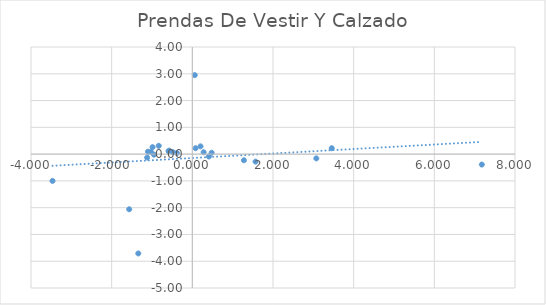
| Category | Prendas De Vestir Y Calzado |
|---|---|
| 0.06052582200249956 | 2.95 |
| -1.339539147515001 | -3.71 |
| -1.1203229332582998 | -0.13 |
| -0.9862037445886013 | 0.26 |
| -3.4662710747771994 | -1 |
| 0.4103518494638997 | -0.09 |
| -1.5653149541481977 | -2.06 |
| 1.5673496706761991 | -0.28 |
| 7.1770364527009995 | -0.39 |
| 0.47884246635880034 | 0.05 |
| -0.832734952533401 | 0.31 |
| 3.4562493478376117 | 0.22 |
| 0.28079979651694786 | 0.07 |
| -0.5906758229193689 | 0.11 |
| -0.38208630553888956 | 0.04 |
| -0.5726169698249004 | 0.13 |
| 0.08025158798270066 | 0.22 |
| 1.2789830493301095 | -0.23 |
| -1.1005497828799102 | 0.09 |
| 0.20330044603610042 | 0.29 |
| -0.48222478231940147 | 0.07 |
| -0.9518304220709997 | -0.02 |
| -1.027059621055 | 0.08 |
| 3.074367518631871 | -0.16 |